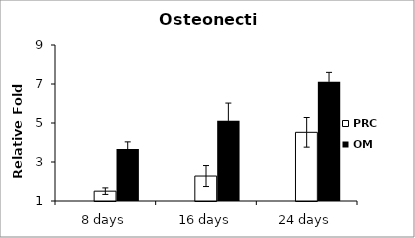
| Category | FBS | PRC | OM |
|---|---|---|---|
| 8 days |  | 1.505 | 3.66 |
| 16 days |  | 2.28 | 5.113 |
| 24 days |  | 4.522 | 7.12 |